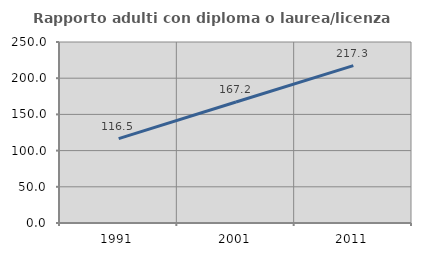
| Category | Rapporto adulti con diploma o laurea/licenza media  |
|---|---|
| 1991.0 | 116.486 |
| 2001.0 | 167.177 |
| 2011.0 | 217.322 |